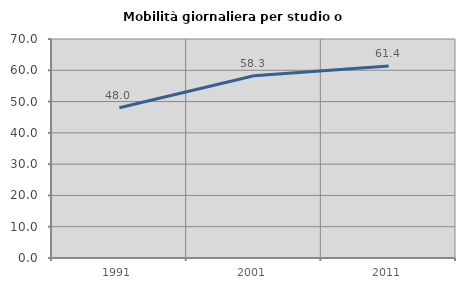
| Category | Mobilità giornaliera per studio o lavoro |
|---|---|
| 1991.0 | 48.013 |
| 2001.0 | 58.28 |
| 2011.0 | 61.371 |